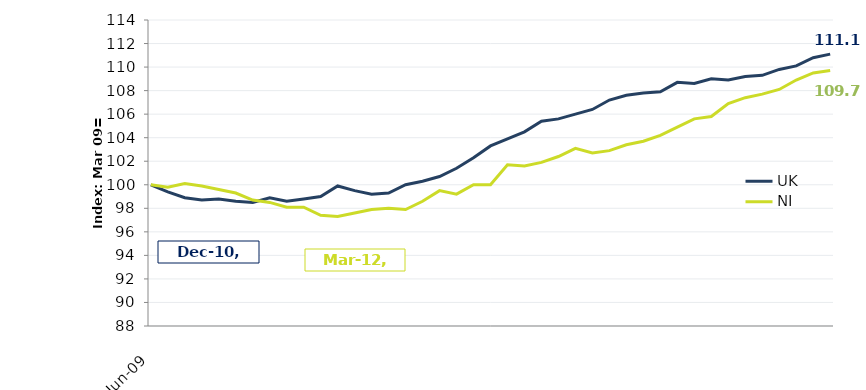
| Category | UK |
|---|---|
| 2009-06-01 | 100 |
| 2009-09-01 | 99.4 |
| 2009-12-01 | 98.9 |
| 2010-03-01 | 98.7 |
| 2010-06-01 | 98.8 |
| 2010-09-01 | 98.6 |
| 2010-12-01 | 98.5 |
| 2011-03-01 | 98.9 |
| 2011-06-01 | 98.6 |
| 2011-09-01 | 98.8 |
| 2011-12-01 | 99 |
| 2012-03-01 | 99.9 |
| 2012-06-01 | 99.5 |
| 2012-09-01 | 99.2 |
| 2012-12-01 | 99.3 |
| 2013-03-01 | 100 |
| 2013-06-01 | 100.3 |
| 2013-09-01 | 100.7 |
| 2013-12-01 | 101.4 |
| 2014-03-01 | 102.3 |
| 2014-06-01 | 103.3 |
| 2014-09-01 | 103.9 |
| 2014-12-01 | 104.5 |
| 2015-03-01 | 105.4 |
| 2015-06-01 | 105.6 |
| 2015-09-01 | 106 |
| 2015-12-01 | 106.4 |
| 2016-03-01 | 107.2 |
| 2016-06-01 | 107.6 |
| 2016-09-01 | 107.8 |
| 2016-12-01 | 107.9 |
| 2017-03-01 | 108.7 |
| 2017-06-01 | 108.6 |
| 2017-09-01 | 109 |
| 2017-12-01 | 108.9 |
| 2018-03-01 | 109.2 |
| 2018-06-01 | 109.3 |
| 2018-09-01 | 109.8 |
| 2018-12-01 | 110.1 |
| 2019-03-01 | 110.8 |
| 2019-06-01 | 111.1 |